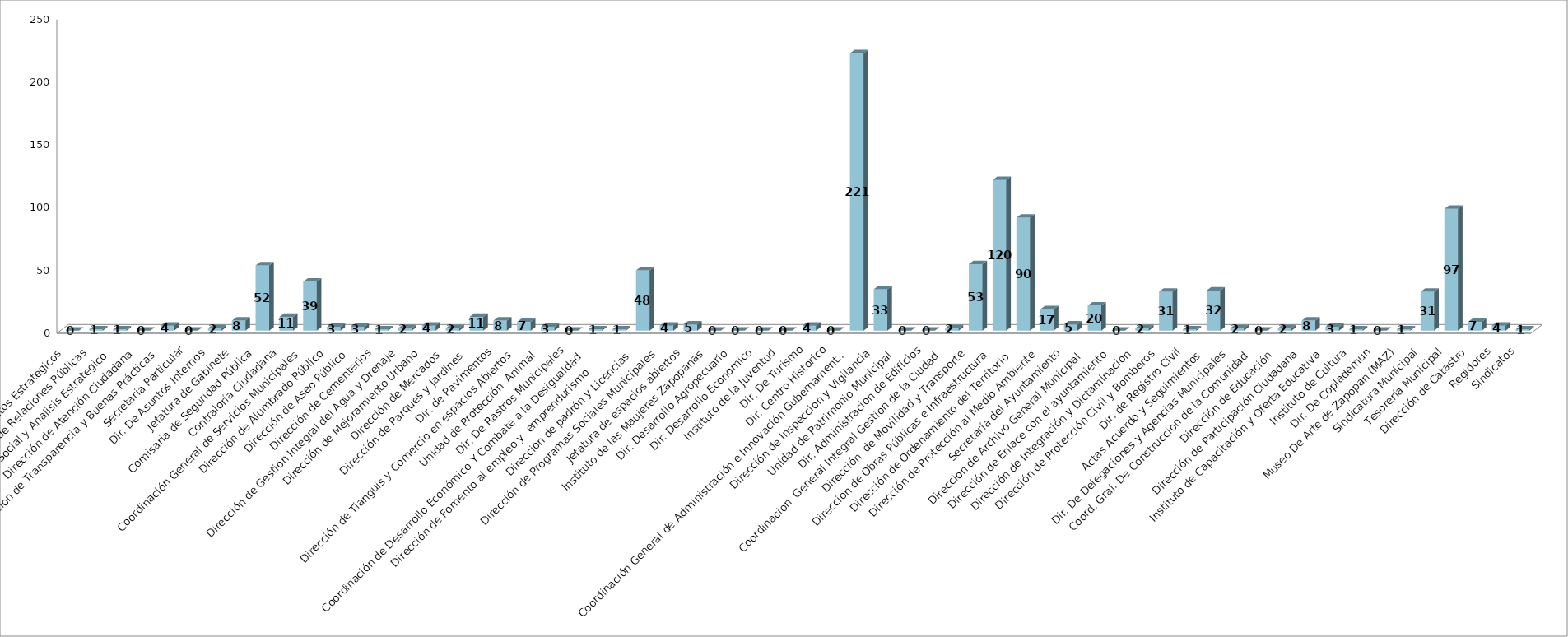
| Category | Series 0 | Series 1 |
|---|---|---|
| Area de Proyectos Estratégicos |  | 0 |
| Área de Relaciones Públicas |  | 1 |
| Comunicación Social y Analisis Estrategico  |  | 1 |
| Dirección de Atención Ciudadana |  | 0 |
| Dirección de Transparencia y Buenas Prácticas |  | 4 |
| Secretaria Particular |  | 0 |
| Dir. De Asuntos Internos |  | 2 |
| Jefatura de Gabinete |  | 8 |
| Comisaria de Seguridad Pública |  | 52 |
| Contraloría Ciudadana |  | 11 |
| Coordinación General de Servicios Municipales |  | 39 |
| Dirección de Alumbrado Público |  | 3 |
| Dirección de Aseo Público  |  | 3 |
| Dirección de Cementerios |  | 1 |
| Dirección de Gestión Integral del Agua y Drenaje |  | 2 |
| Dirección de Mejoramiento Urbano |  | 4 |
| Dirección de Mercados  |  | 2 |
| Dirección de Parques y Jardines  |  | 11 |
| Dir. de Pavimentos |  | 8 |
| Dirección de Tianguis y Comercio en espacios Abiertos |  | 7 |
| Unidad de Protección  Animal  |  | 3 |
| Dir. De Rastros Municipales |  | 0 |
| Coordinación de Desarrollo Económico Y Combate a la Desigualdad |  | 1 |
| Dirección de Fomento al empleo y  emprendurismo         |  | 1 |
| Dirección de padrón y Licencias  |  | 48 |
| Dirección de Programas Sociales Municipales |  | 4 |
| Jefatura de espacios abiertos |  | 5 |
| Instituto de las Maujeres Zapopanas |  | 0 |
|  Dir. Desarrollo Agropecuario |  | 0 |
| Dir. Desarrollo Economico |  | 0 |
| Instituto de la Juventud |  | 0 |
| Dir. De Turismo |  | 4 |
| Dir. Centro Historico |  | 0 |
| Coordinación General de Administración e Innovación Gubernamental |  | 221 |
| Dirección de Inspección y Vigilancia |  | 33 |
| Unidad de Patrimonio Municipal  |  | 0 |
| Dir. Administracion de Edificios |  | 0 |
| Coordinacion  General Integral Gestion de la Ciudad |  | 2 |
| Dirección  de Movilidad y Transporte |  | 53 |
| Dirección de Obras Públicas e Infraestructura |  | 120 |
| Dirección de Ordenamiento del Territorio  |  | 90 |
| Dirección de Protección al Medio Ambiente  |  | 17 |
| Secretaría del Ayuntamiento |  | 5 |
| Dirección de Archivo General Municipal  |  | 20 |
| Dirección de Enlace con el ayuntamiento |  | 0 |
| Dirección de Integración y Dictaminación |  | 2 |
| Dirección de Protección Civil y Bomberos |  | 31 |
| Dir. de Registro Civil |  | 1 |
| Actas Acuerdo y Seguimientos  |  | 32 |
| Dir. De Delegaciones y Agencias Municipales |  | 2 |
| Coord. Gral. De Construccion de la Comunidad |  | 0 |
| Dirección de Educación  |  | 2 |
| Dirección de Participación Ciudadana |  | 8 |
| Instituto de Capacitación y Oferta Educativa |  | 3 |
| Instituto de Cultura  |  | 1 |
| Dir. De Coplademun |  | 0 |
| Museo De Arte de Zapopan (MAZ) |  | 1 |
| Sindicatura Municipal |  | 31 |
| Tesorería Municipal |  | 97 |
| Dirección de Catastro |  | 7 |
| Regidores |  | 4 |
| Sindicatos |  | 1 |